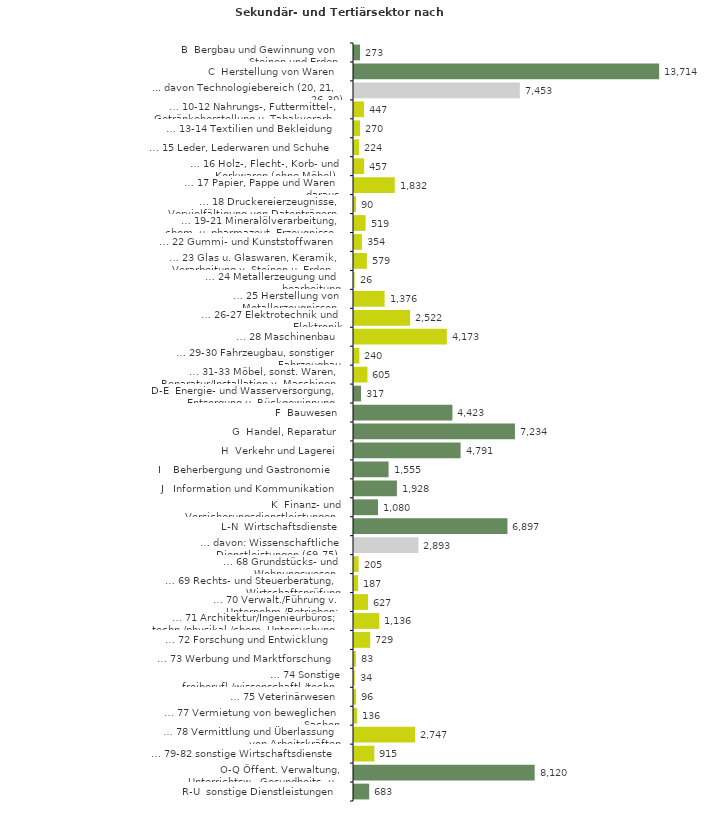
| Category | Series 0 |
|---|---|
| B  Bergbau und Gewinnung von Steinen und Erden | 273 |
| C  Herstellung von Waren | 13714 |
| ... davon Technologiebereich (20, 21, 26-30) | 7453 |
| … 10-12 Nahrungs-, Futtermittel-, Getränkeherstellung u. Tabakverarb. | 447 |
| … 13-14 Textilien und Bekleidung | 270 |
| … 15 Leder, Lederwaren und Schuhe | 224 |
| … 16 Holz-, Flecht-, Korb- und Korkwaren (ohne Möbel)  | 457 |
| … 17 Papier, Pappe und Waren daraus  | 1832 |
| … 18 Druckereierzeugnisse, Vervielfältigung von Datenträgern | 90 |
| … 19-21 Mineralölverarbeitung, chem. u. pharmazeut. Erzeugnisse | 519 |
| … 22 Gummi- und Kunststoffwaren | 354 |
| … 23 Glas u. Glaswaren, Keramik, Verarbeitung v. Steinen u. Erden  | 579 |
| … 24 Metallerzeugung und -bearbeitung | 26 |
| … 25 Herstellung von Metallerzeugnissen  | 1376 |
| … 26-27 Elektrotechnik und Elektronik | 2522 |
| … 28 Maschinenbau | 4173 |
| … 29-30 Fahrzeugbau, sonstiger Fahrzeugbau | 240 |
| … 31-33 Möbel, sonst. Waren, Reparatur/Installation v. Maschinen | 605 |
| D-E  Energie- und Wasserversorgung, Entsorgung u. Rückgewinnung | 317 |
| F  Bauwesen | 4423 |
| G  Handel, Reparatur | 7234 |
| H  Verkehr und Lagerei | 4791 |
| I    Beherbergung und Gastronomie | 1555 |
| J   Information und Kommunikation | 1928 |
| K  Finanz- und Versicherungsdienstleistungen | 1080 |
| L-N  Wirtschaftsdienste | 6897 |
| … davon: Wissenschaftliche Dienstleistungen (69-75) | 2893 |
| … 68 Grundstücks- und Wohnungswesen  | 205 |
| … 69 Rechts- und Steuerberatung, Wirtschaftsprüfung | 187 |
| … 70 Verwalt./Führung v. Unternehm./Betrieben; Unternehmensberat. | 627 |
| … 71 Architektur/Ingenieurbüros; techn./physikal./chem. Untersuchung | 1136 |
| … 72 Forschung und Entwicklung  | 729 |
| … 73 Werbung und Marktforschung | 83 |
| … 74 Sonstige freiberufl./wissenschaftl./techn. Tätigkeiten | 34 |
| … 75 Veterinärwesen | 96 |
| … 77 Vermietung von beweglichen Sachen  | 136 |
| … 78 Vermittlung und Überlassung von Arbeitskräften | 2747 |
| … 79-82 sonstige Wirtschaftsdienste | 915 |
| O-Q Öffent. Verwaltung, Unterrichtsw., Gesundheits- u. Sozialwesen | 8120 |
| R-U  sonstige Dienstleistungen | 683 |